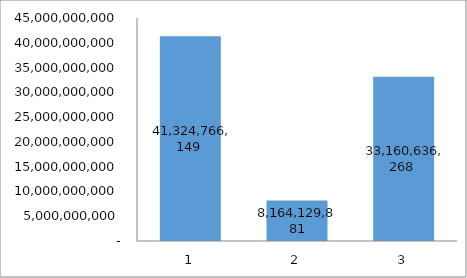
| Category | Series 0 |
|---|---|
| 0 | 41324766149 |
| 1 | 8164129881 |
| 2 | 33160636268 |